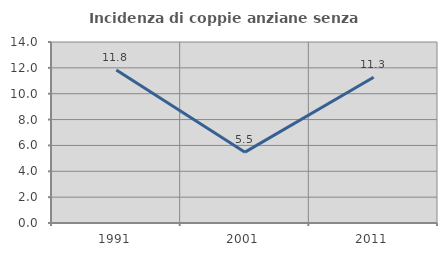
| Category | Incidenza di coppie anziane senza figli  |
|---|---|
| 1991.0 | 11.828 |
| 2001.0 | 5.479 |
| 2011.0 | 11.278 |